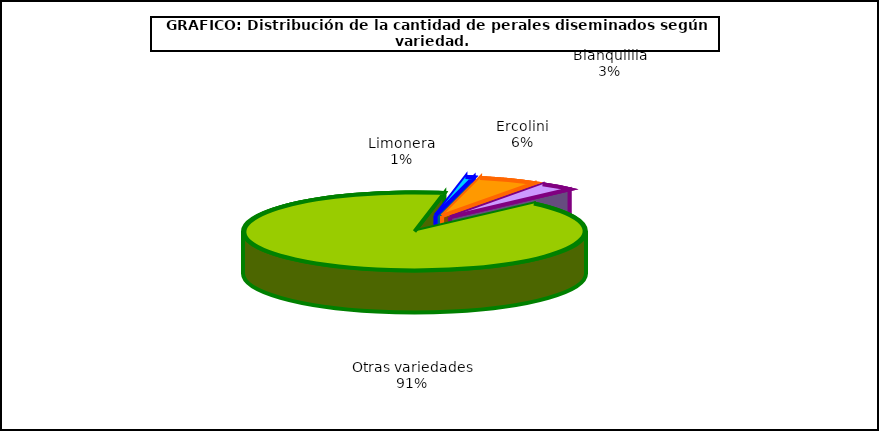
| Category | arboles |
|---|---|
| 0 | 3.948 |
| 1 | 27.872 |
| 2 | 16.192 |
| 3 | 458.575 |